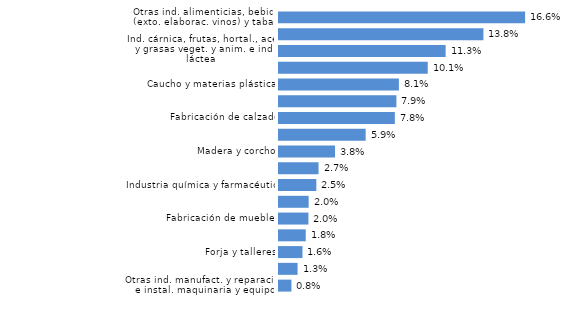
| Category | La Rioja |
|---|---|
| Otras ind. manufact. y reparación e instal. maquinaria y equipo | 0.008 |
| Metalurgia y fabricación de elementos metálicos para la construcción | 0.013 |
| Forja y talleres | 0.016 |
| Ind. textil, confección, cuero, marroquinería y viaje | 0.018 |
| Fabricación de muebles | 0.02 |
| Papel, artes gráficas y reproducción de soportes grabados | 0.02 |
| Industria química y farmacéutica | 0.025 |
| Productos minerales no metálicos diversos | 0.027 |
| Madera y corcho | 0.038 |
| Fabricación de maquinaria, equipo y material de transporte | 0.059 |
| Fabricación de calzado | 0.078 |
| Fabric. otros pdtos. metál., material y eq. eléct., electrón. y óptico | 0.079 |
| Caucho y materias plásticas | 0.081 |
| Industrias extractivas, energía, agua y residuos | 0.101 |
| Ind. cárnica, frutas, hortal., aceit. y grasas veget. y anim. e ind. láctea | 0.113 |
| Elaboración de vinos | 0.138 |
| Otras ind. alimenticias, bebidas (exto. elaborac. vinos) y tabaco | 0.166 |